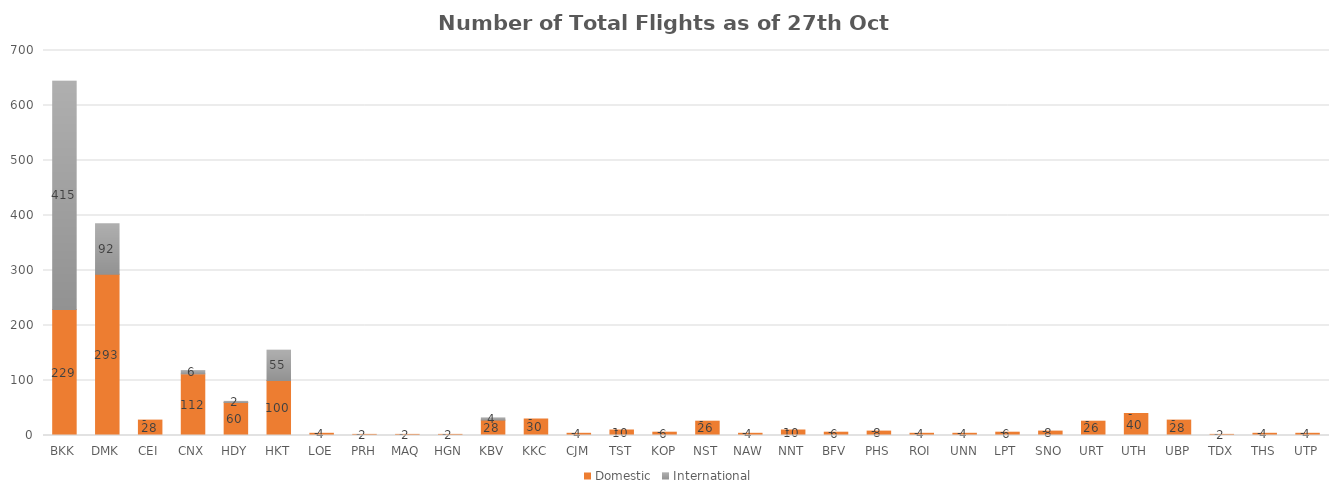
| Category | Domestic | International |
|---|---|---|
| BKK | 229 | 415 |
| DMK | 293 | 92 |
| CEI | 28 | 0 |
| CNX | 112 | 6 |
| HDY | 60 | 2 |
| HKT | 100 | 55 |
| LOE | 4 | 0 |
| PRH | 2 | 0 |
| MAQ | 2 | 0 |
| HGN | 2 | 0 |
| KBV | 28 | 4 |
| KKC | 30 | 0 |
| CJM | 4 | 0 |
| TST | 10 | 0 |
| KOP | 6 | 0 |
| NST | 26 | 0 |
| NAW | 4 | 0 |
| NNT | 10 | 0 |
| BFV | 6 | 0 |
| PHS | 8 | 0 |
| ROI | 4 | 0 |
| UNN | 4 | 0 |
| LPT | 6 | 0 |
| SNO | 8 | 0 |
| URT | 26 | 0 |
| UTH | 40 | 0 |
| UBP | 28 | 0 |
| TDX | 2 | 0 |
| THS | 4 | 0 |
| UTP | 4 | 0 |